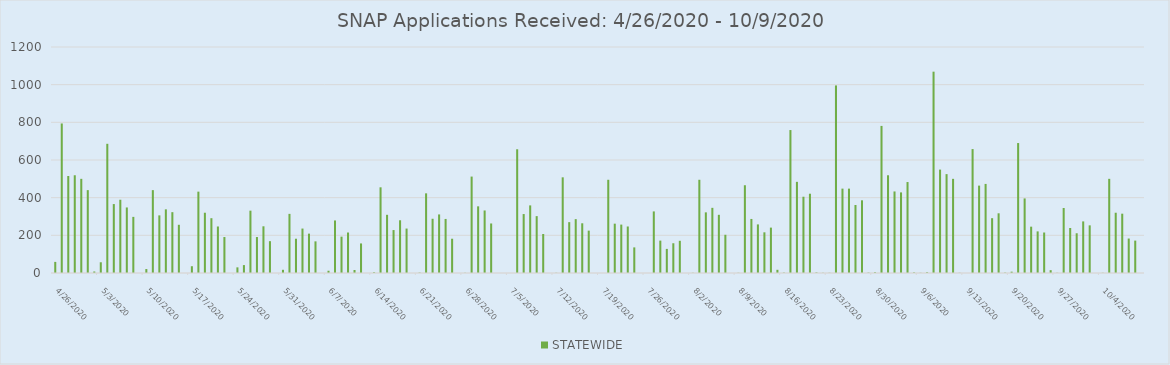
| Category | STATEWIDE |
|---|---|
| 4/26/20 | 59 |
| 4/27/20 | 794 |
| 4/28/20 | 515 |
| 4/29/20 | 519 |
| 4/30/20 | 500 |
| 5/1/20 | 440 |
| 5/2/20 | 8 |
| 5/3/20 | 57 |
| 5/4/20 | 686 |
| 5/5/20 | 366 |
| 5/6/20 | 389 |
| 5/7/20 | 348 |
| 5/8/20 | 298 |
| 5/10/20 | 21 |
| 5/11/20 | 440 |
| 5/12/20 | 306 |
| 5/13/20 | 338 |
| 5/14/20 | 323 |
| 5/15/20 | 256 |
| 5/17/20 | 36 |
| 5/18/20 | 432 |
| 5/19/20 | 320 |
| 5/20/20 | 291 |
| 5/21/20 | 247 |
| 5/22/20 | 191 |
| 5/24/20 | 30 |
| 5/25/20 | 42 |
| 5/26/20 | 331 |
| 5/27/20 | 191 |
| 5/28/20 | 248 |
| 5/29/20 | 169 |
| 5/31/20 | 17 |
| 6/1/20 | 314 |
| 6/2/20 | 182 |
| 6/3/20 | 236 |
| 6/4/20 | 209 |
| 6/5/20 | 168 |
| 6/7/20 | 12 |
| 6/8/20 | 279 |
| 6/9/20 | 193 |
| 6/10/20 | 215 |
| 6/11/20 | 16 |
| 6/12/20 | 157 |
| 6/14/20 | 4 |
| 6/15/20 | 455 |
| 6/16/20 | 309 |
| 6/17/20 | 228 |
| 6/18/20 | 280 |
| 6/19/20 | 236 |
| 6/21/20 | 2 |
| 6/22/20 | 423 |
| 6/23/20 | 288 |
| 6/24/20 | 311 |
| 6/25/20 | 287 |
| 6/26/20 | 182 |
| 6/28/20 | 1 |
| 6/29/20 | 512 |
| 6/30/20 | 354 |
| 7/1/20 | 332 |
| 7/2/20 | 263 |
| 7/6/20 | 657 |
| 7/7/20 | 313 |
| 7/8/20 | 359 |
| 7/9/20 | 302 |
| 7/10/20 | 207 |
| 7/12/20 | 1 |
| 7/13/20 | 508 |
| 7/14/20 | 270 |
| 7/15/20 | 286 |
| 7/16/20 | 264 |
| 7/17/20 | 225 |
| 7/20/20 | 495 |
| 7/21/20 | 262 |
| 7/22/20 | 257 |
| 7/23/20 | 247 |
| 7/24/20 | 136 |
| 7/27/20 | 327 |
| 7/28/20 | 172 |
| 7/29/20 | 128 |
| 7/30/20 | 158 |
| 7/31/20 | 171 |
| 8/2/20 | 1 |
| 8/3/20 | 495 |
| 8/4/20 | 322 |
| 8/5/20 | 346 |
| 8/6/20 | 309 |
| 8/7/20 | 203 |
| 8/9/20 | 1 |
| 8/10/20 | 466 |
| 8/11/20 | 287 |
| 8/12/20 | 258 |
| 8/13/20 | 216 |
| 8/14/20 | 241 |
| 8/15/20 | 17 |
| 8/16/20 | 2 |
| 8/17/20 | 759 |
| 8/18/20 | 484 |
| 8/19/20 | 405 |
| 8/20/20 | 421 |
| 8/21/20 | 3 |
| 8/22/20 | 1 |
| 8/23/20 | 1 |
| 8/24/20 | 996 |
| 8/25/20 | 448 |
| 8/26/20 | 448 |
| 8/27/20 | 361 |
| 8/28/20 | 386 |
| 8/29/20 | 2 |
| 8/30/20 | 4 |
| 8/31/20 | 781 |
| 9/1/20 | 519 |
| 9/2/20 | 433 |
| 9/3/20 | 428 |
| 9/4/20 | 483 |
| 9/5/20 | 3 |
| 9/6/20 | 1 |
| 9/7/20 | 4 |
| 9/8/20 | 1069 |
| 9/9/20 | 549 |
| 9/10/20 | 525 |
| 9/11/20 | 500 |
| 9/12/20 | 1 |
| 9/14/20 | 658 |
| 9/15/20 | 464 |
| 9/16/20 | 473 |
| 9/17/20 | 291 |
| 9/18/20 | 317 |
| 9/19/20 | 2 |
| 9/20/20 | 7 |
| 9/21/20 | 690 |
| 9/22/20 | 396 |
| 9/23/20 | 246 |
| 9/24/20 | 221 |
| 9/25/20 | 215 |
| 9/26/20 | 15 |
| 9/27/20 | 1 |
| 9/28/20 | 345 |
| 9/29/20 | 239 |
| 9/30/20 | 211 |
| 10/1/20 | 274 |
| 10/2/20 | 253 |
| 10/4/20 | 1 |
| 10/5/20 | 500 |
| 10/6/20 | 320 |
| 10/7/20 | 315 |
| 10/8/20 | 183 |
| 10/9/20 | 172 |